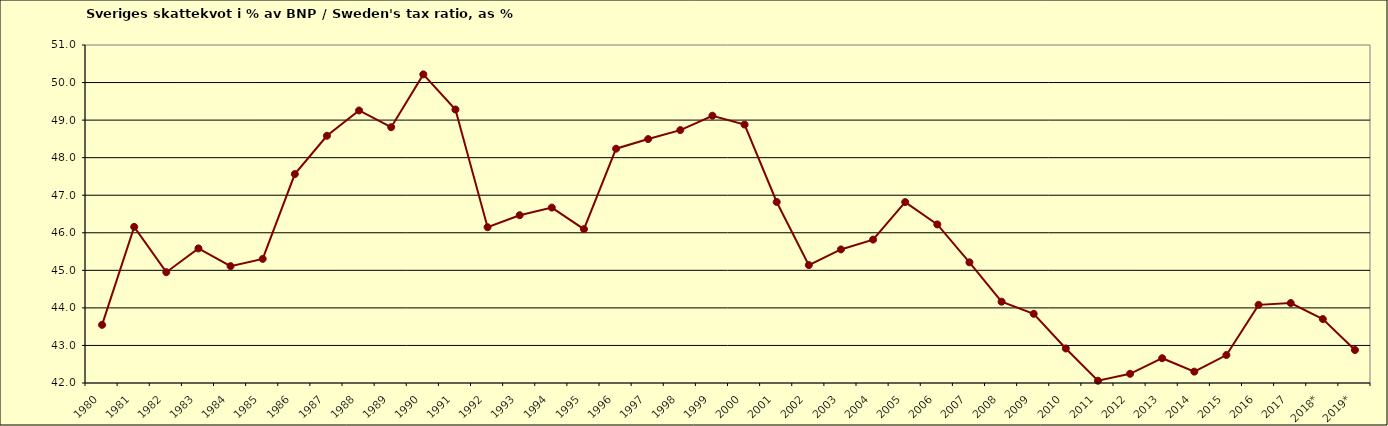
| Category | Series 0 |
|---|---|
| 1980 | 43.549 |
| 1981 | 46.157 |
| 1982 | 44.951 |
| 1983 | 45.584 |
| 1984 | 45.112 |
| 1985 | 45.305 |
| 1986 | 47.564 |
| 1987 | 48.584 |
| 1988 | 49.257 |
| 1989 | 48.81 |
| 1990 | 50.218 |
| 1991 | 49.282 |
| 1992 | 46.148 |
| 1993 | 46.468 |
| 1994 | 46.671 |
| 1995 | 46.097 |
| 1996 | 48.239 |
| 1997 | 48.495 |
| 1998 | 48.734 |
| 1999 | 49.117 |
| 2000 | 48.881 |
| 2001 | 46.82 |
| 2002 | 45.14 |
| 2003 | 45.556 |
| 2004 | 45.818 |
| 2005 | 46.817 |
| 2006 | 46.222 |
| 2007 | 45.213 |
| 2008 | 44.166 |
| 2009 | 43.842 |
| 2010 | 42.919 |
| 2011 | 42.061 |
| 2012 | 42.245 |
| 2013 | 42.66 |
| 2014 | 42.303 |
| 2015 | 42.745 |
| 2016 | 44.08 |
| 2017 | 44.129 |
| 2018* | 43.703 |
| 2019* | 42.878 |